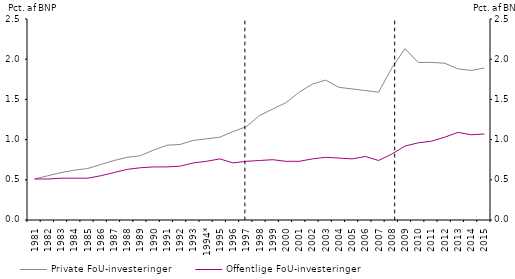
| Category | Private FoU-investeringer | Offentlige FoU-investeringer |
|---|---|---|
| 1981 | 0.51 | 0.51 |
| 1982 | 0.55 | 0.51 |
| 1983 | 0.59 | 0.52 |
| 1984 | 0.62 | 0.52 |
| 1985 | 0.64 | 0.52 |
| 1986 | 0.69 | 0.55 |
| 1987 | 0.74 | 0.59 |
| 1988 | 0.78 | 0.63 |
| 1989 | 0.8 | 0.65 |
| 1990 | 0.87 | 0.66 |
| 1991 | 0.93 | 0.66 |
| 1992 | 0.94 | 0.67 |
| 1993 | 0.99 | 0.71 |
| 1994* | 1.01 | 0.73 |
| 1995 | 1.03 | 0.76 |
| 1996 | 1.1 | 0.71 |
| 1997 | 1.16 | 0.73 |
| 1998 | 1.3 | 0.74 |
| 1999 | 1.38 | 0.75 |
| 2000 | 1.46 | 0.73 |
| 2001 | 1.59 | 0.73 |
| 2002 | 1.69 | 0.76 |
| 2003 | 1.74 | 0.78 |
| 2004 | 1.65 | 0.77 |
| 2005 | 1.63 | 0.76 |
| 2006 | 1.61 | 0.79 |
| 2007 | 1.59 | 0.74 |
| 2008 | 1.89 | 0.82 |
| 2009 | 2.13 | 0.92 |
| 2010 | 1.96 | 0.96 |
| 2011 | 1.96 | 0.98 |
| 2012 | 1.95 | 1.03 |
| 2013 | 1.88 | 1.09 |
| 2014 | 1.86 | 1.06 |
| 2015 | 1.89 | 1.07 |